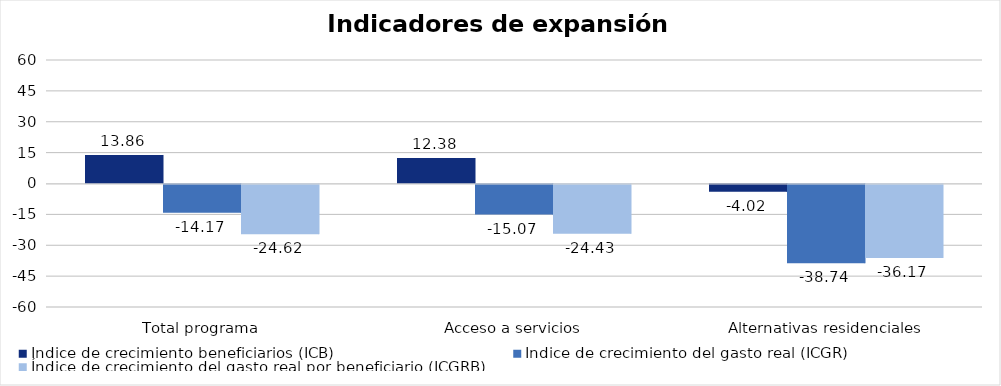
| Category | Índice de crecimiento beneficiarios (ICB)  | Índice de crecimiento del gasto real (ICGR)  | Índice de crecimiento del gasto real por beneficiario (ICGRB)  |
|---|---|---|---|
| Total programa | 13.86 | -14.171 | -24.619 |
| Acceso a servicios | 12.381 | -15.072 | -24.429 |
| Alternativas residenciales | -4.023 | -38.74 | -36.172 |